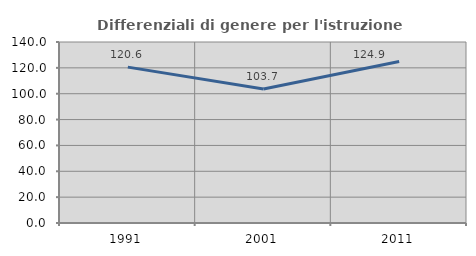
| Category | Differenziali di genere per l'istruzione superiore |
|---|---|
| 1991.0 | 120.573 |
| 2001.0 | 103.689 |
| 2011.0 | 124.906 |